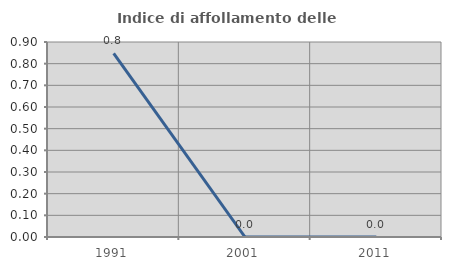
| Category | Indice di affollamento delle abitazioni  |
|---|---|
| 1991.0 | 0.847 |
| 2001.0 | 0 |
| 2011.0 | 0 |